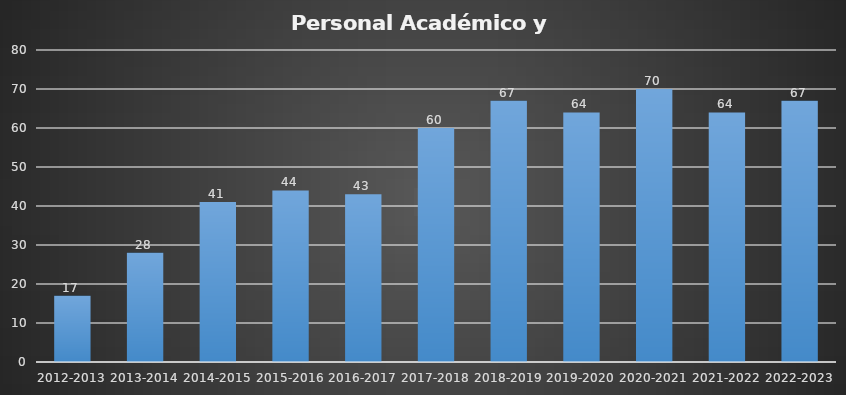
| Category | Series 0 |
|---|---|
| 2012-2013 | 17 |
| 2013-2014 | 28 |
| 2014-2015 | 41 |
| 2015-2016 | 44 |
| 2016-2017 | 43 |
| 2017-2018 | 60 |
| 2018-2019 | 67 |
| 2019-2020 | 64 |
| 2020-2021 | 70 |
| 2021-2022 | 64 |
| 2022-2023 | 67 |